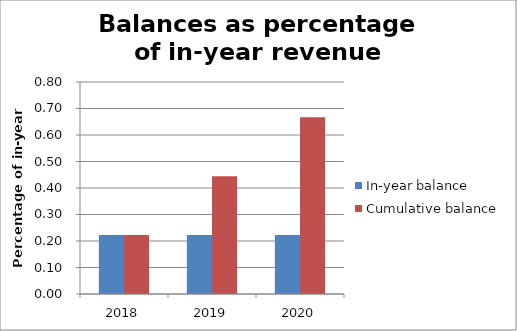
| Category | In-year balance | Cumulative balance |
|---|---|---|
| 2018.0 | 0.222 | 0.222 |
| 2019.0 | 0.222 | 0.444 |
| 2020.0 | 0.222 | 0.667 |